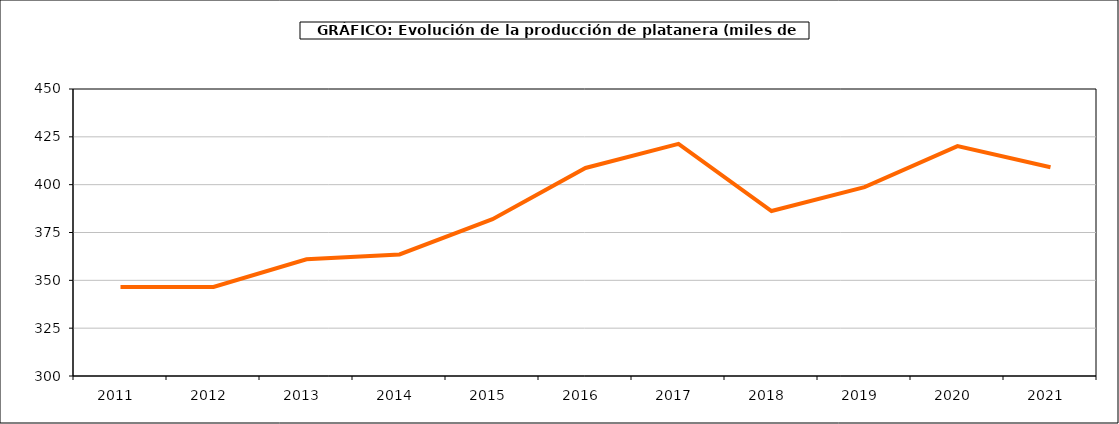
| Category | producción platanera |
|---|---|
| 2011.0 | 346.509 |
| 2012.0 | 346.509 |
| 2013.0 | 360.987 |
| 2014.0 | 363.552 |
| 2015.0 | 381.983 |
| 2016.0 | 408.716 |
| 2017.0 | 421.313 |
| 2018.0 | 386.226 |
| 2019.0 | 398.722 |
| 2020.0 | 420.144 |
| 2021.0 | 409.106 |